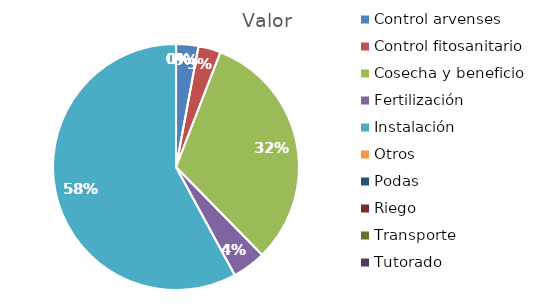
| Category | Valor |
|---|---|
| Control arvenses | 77632 |
| Control fitosanitario | 77632 |
| Cosecha y beneficio | 840000 |
| Fertilización | 116448 |
| Instalación | 1530903 |
| Otros | 0 |
| Podas | 0 |
| Riego | 0 |
| Transporte | 0 |
| Tutorado | 0 |